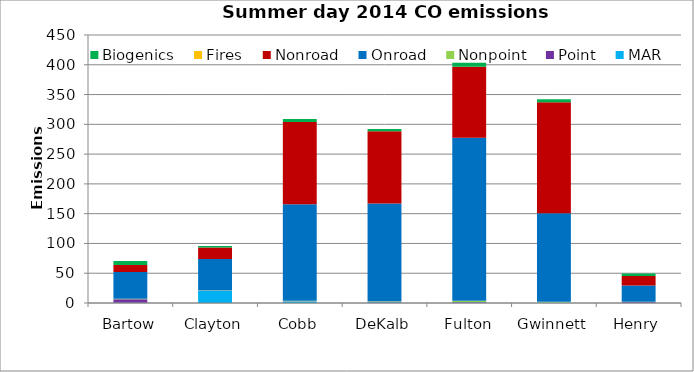
| Category | MAR | Point | Nonpoint | Onroad | Nonroad | Fires | Biogenics |
|---|---|---|---|---|---|---|---|
| Bartow | 0.529 | 5.836 | 0.821 | 44.886 | 11.633 | 0.019 | 6.657 |
| Clayton | 20.778 | 0.149 | 0.304 | 52.499 | 19.373 | 0 | 2.673 |
| Cobb | 2.314 | 0.512 | 1.011 | 162.123 | 138.075 | 0 | 4.797 |
| DeKalb | 1.177 | 0.722 | 0.964 | 164.356 | 120.958 | 0 | 3.901 |
| Fulton | 0.855 | 0.805 | 2.262 | 273.421 | 119.507 | 0 | 6.349 |
| Gwinnett | 0.69 | 0.352 | 1.082 | 148.572 | 186.498 | 0 | 4.992 |
| Henry | 0.238 | 1.358 | 0.622 | 27.108 | 15.873 | 0 | 4.185 |